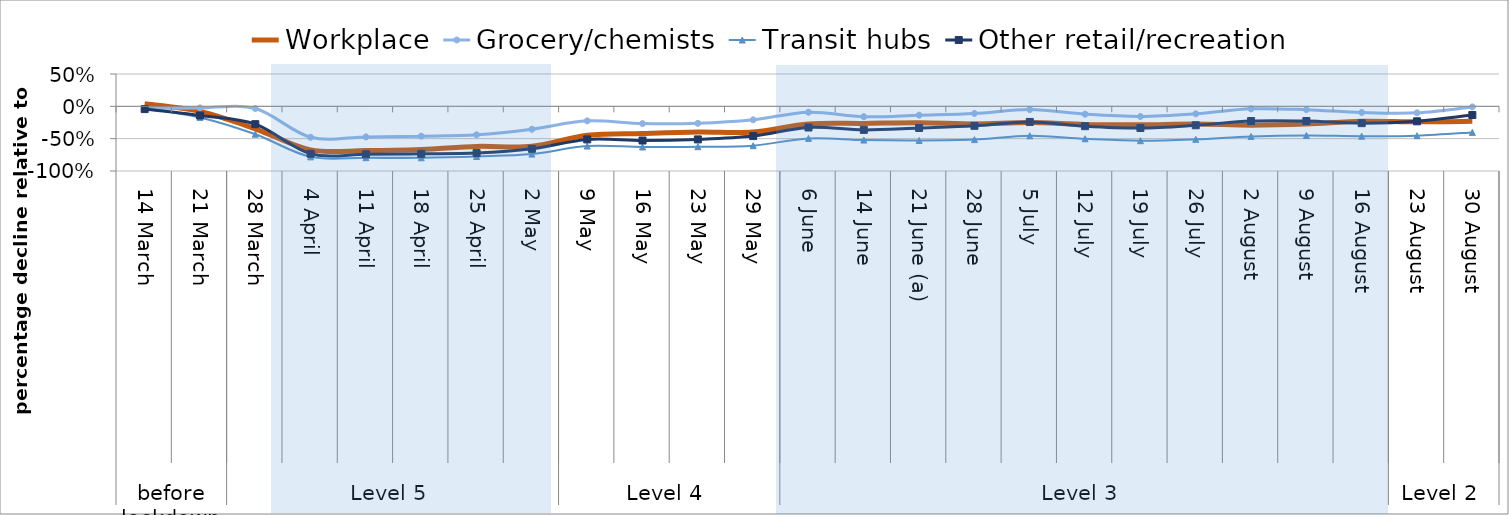
| Category | Workplace | Grocery/chemists | Transit hubs | Other retail/recreation |
|---|---|---|---|---|
| 0 | 0.04 | -0.031 | -0.027 | -0.043 |
| 1 | -0.077 | -0.024 | -0.171 | -0.141 |
| 2 | -0.347 | -0.034 | -0.431 | -0.276 |
| 3 | -0.673 | -0.479 | -0.781 | -0.733 |
| 4 | -0.684 | -0.473 | -0.794 | -0.741 |
| 5 | -0.669 | -0.461 | -0.796 | -0.734 |
| 6 | -0.62 | -0.44 | -0.776 | -0.723 |
| 7 | -0.617 | -0.354 | -0.739 | -0.657 |
| 8 | -0.449 | -0.224 | -0.614 | -0.511 |
| 9 | -0.42 | -0.267 | -0.629 | -0.529 |
| 10 | -0.399 | -0.263 | -0.624 | -0.511 |
| 11 | -0.398 | -0.208 | -0.608 | -0.46 |
| 12 | -0.274 | -0.091 | -0.496 | -0.327 |
| 13 | -0.264 | -0.16 | -0.521 | -0.364 |
| 14 | -0.253 | -0.137 | -0.528 | -0.335 |
| 15 | -0.271 | -0.11 | -0.514 | -0.301 |
| 16 | -0.251 | -0.05 | -0.456 | -0.241 |
| 17 | -0.281 | -0.121 | -0.501 | -0.307 |
| 18 | -0.286 | -0.157 | -0.531 | -0.336 |
| 19 | -0.273 | -0.116 | -0.51 | -0.293 |
| 20 | -0.291 | -0.039 | -0.466 | -0.227 |
| 21 | -0.274 | -0.051 | -0.45 | -0.227 |
| 22 | -0.232 | -0.095 | -0.462 | -0.26 |
| 23 | -0.24 | -0.1 | -0.454 | -0.231 |
| 24 | -0.231 | -0.009 | -0.403 | -0.134 |